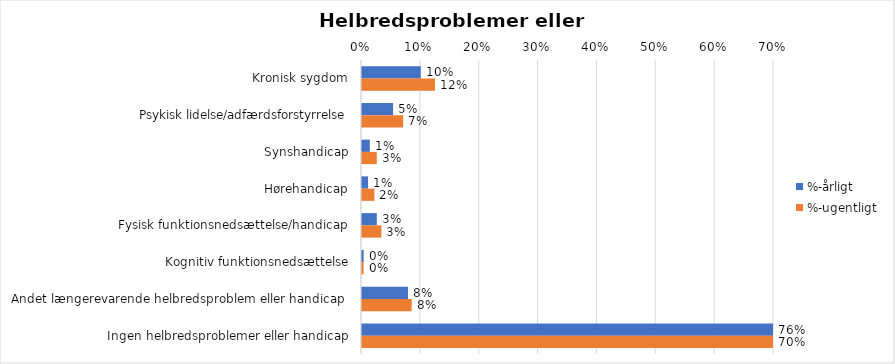
| Category | %-årligt | %-ugentligt |
|---|---|---|
| Kronisk sygdom | 0.1 | 0.124 |
| Psykisk lidelse/adfærdsforstyrrelse | 0.053 | 0.07 |
| Synshandicap | 0.013 | 0.025 |
| Hørehandicap | 0.01 | 0.021 |
| Fysisk funktionsnedsættelse/handicap | 0.025 | 0.033 |
| Kognitiv funktionsnedsættelse | 0.003 | 0.003 |
| Andet længerevarende helbredsproblem eller handicap  | 0.078 | 0.084 |
| Ingen helbredsproblemer eller handicap | 0.756 | 0.703 |